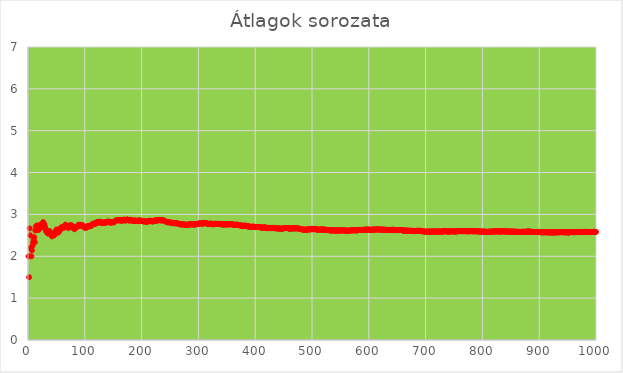
| Category | Series 0 |
|---|---|
| 1.0 | 2 |
| 2.0 | 1.5 |
| 3.0 | 2.667 |
| 4.0 | 2.5 |
| 5.0 | 2.2 |
| 6.0 | 2 |
| 7.0 | 2.143 |
| 8.0 | 2.25 |
| 9.0 | 2.333 |
| 10.0 | 2.4 |
| 11.0 | 2.455 |
| 12.0 | 2.333 |
| 13.0 | 2.615 |
| 14.0 | 2.714 |
| 15.0 | 2.733 |
| 16.0 | 2.625 |
| 17.0 | 2.706 |
| 18.0 | 2.667 |
| 19.0 | 2.632 |
| 20.0 | 2.75 |
| 21.0 | 2.714 |
| 22.0 | 2.682 |
| 23.0 | 2.696 |
| 24.0 | 2.708 |
| 25.0 | 2.76 |
| 26.0 | 2.808 |
| 27.0 | 2.815 |
| 28.0 | 2.75 |
| 29.0 | 2.759 |
| 30.0 | 2.7 |
| 31.0 | 2.645 |
| 32.0 | 2.594 |
| 33.0 | 2.606 |
| 34.0 | 2.559 |
| 35.0 | 2.543 |
| 36.0 | 2.556 |
| 37.0 | 2.595 |
| 38.0 | 2.605 |
| 39.0 | 2.564 |
| 40.0 | 2.525 |
| 41.0 | 2.512 |
| 42.0 | 2.476 |
| 43.0 | 2.512 |
| 44.0 | 2.545 |
| 45.0 | 2.511 |
| 46.0 | 2.5 |
| 47.0 | 2.511 |
| 48.0 | 2.542 |
| 49.0 | 2.592 |
| 50.0 | 2.64 |
| 51.0 | 2.608 |
| 52.0 | 2.596 |
| 53.0 | 2.566 |
| 54.0 | 2.574 |
| 55.0 | 2.618 |
| 56.0 | 2.661 |
| 57.0 | 2.632 |
| 58.0 | 2.672 |
| 59.0 | 2.695 |
| 60.0 | 2.683 |
| 61.0 | 2.705 |
| 62.0 | 2.677 |
| 63.0 | 2.683 |
| 64.0 | 2.703 |
| 65.0 | 2.708 |
| 66.0 | 2.758 |
| 67.0 | 2.731 |
| 68.0 | 2.721 |
| 69.0 | 2.696 |
| 70.0 | 2.7 |
| 71.0 | 2.676 |
| 72.0 | 2.722 |
| 73.0 | 2.726 |
| 74.0 | 2.743 |
| 75.0 | 2.72 |
| 76.0 | 2.697 |
| 77.0 | 2.74 |
| 78.0 | 2.718 |
| 79.0 | 2.696 |
| 80.0 | 2.675 |
| 81.0 | 2.654 |
| 82.0 | 2.646 |
| 83.0 | 2.675 |
| 84.0 | 2.679 |
| 85.0 | 2.694 |
| 86.0 | 2.698 |
| 87.0 | 2.713 |
| 88.0 | 2.739 |
| 89.0 | 2.753 |
| 90.0 | 2.733 |
| 91.0 | 2.725 |
| 92.0 | 2.75 |
| 93.0 | 2.731 |
| 94.0 | 2.745 |
| 95.0 | 2.747 |
| 96.0 | 2.74 |
| 97.0 | 2.722 |
| 98.0 | 2.714 |
| 99.0 | 2.697 |
| 100.0 | 2.68 |
| 101.0 | 2.683 |
| 102.0 | 2.706 |
| 103.0 | 2.689 |
| 104.0 | 2.692 |
| 105.0 | 2.714 |
| 106.0 | 2.726 |
| 107.0 | 2.72 |
| 108.0 | 2.722 |
| 109.0 | 2.716 |
| 110.0 | 2.727 |
| 111.0 | 2.721 |
| 112.0 | 2.741 |
| 113.0 | 2.77 |
| 114.0 | 2.763 |
| 115.0 | 2.774 |
| 116.0 | 2.784 |
| 117.0 | 2.778 |
| 118.0 | 2.771 |
| 119.0 | 2.782 |
| 120.0 | 2.8 |
| 121.0 | 2.81 |
| 122.0 | 2.82 |
| 123.0 | 2.821 |
| 124.0 | 2.806 |
| 125.0 | 2.808 |
| 126.0 | 2.825 |
| 127.0 | 2.811 |
| 128.0 | 2.812 |
| 129.0 | 2.798 |
| 130.0 | 2.808 |
| 131.0 | 2.802 |
| 132.0 | 2.803 |
| 133.0 | 2.805 |
| 134.0 | 2.806 |
| 135.0 | 2.8 |
| 136.0 | 2.809 |
| 137.0 | 2.818 |
| 138.0 | 2.804 |
| 139.0 | 2.82 |
| 140.0 | 2.814 |
| 141.0 | 2.83 |
| 142.0 | 2.831 |
| 143.0 | 2.818 |
| 144.0 | 2.806 |
| 145.0 | 2.814 |
| 146.0 | 2.801 |
| 147.0 | 2.816 |
| 148.0 | 2.818 |
| 149.0 | 2.812 |
| 150.0 | 2.82 |
| 151.0 | 2.808 |
| 152.0 | 2.829 |
| 153.0 | 2.837 |
| 154.0 | 2.851 |
| 155.0 | 2.852 |
| 156.0 | 2.859 |
| 157.0 | 2.854 |
| 158.0 | 2.867 |
| 159.0 | 2.862 |
| 160.0 | 2.869 |
| 161.0 | 2.857 |
| 162.0 | 2.858 |
| 163.0 | 2.865 |
| 164.0 | 2.854 |
| 165.0 | 2.855 |
| 166.0 | 2.849 |
| 167.0 | 2.862 |
| 168.0 | 2.869 |
| 169.0 | 2.876 |
| 170.0 | 2.865 |
| 171.0 | 2.854 |
| 172.0 | 2.855 |
| 173.0 | 2.867 |
| 174.0 | 2.879 |
| 175.0 | 2.874 |
| 176.0 | 2.864 |
| 177.0 | 2.859 |
| 178.0 | 2.854 |
| 179.0 | 2.872 |
| 180.0 | 2.861 |
| 181.0 | 2.856 |
| 182.0 | 2.857 |
| 183.0 | 2.863 |
| 184.0 | 2.853 |
| 185.0 | 2.843 |
| 186.0 | 2.844 |
| 187.0 | 2.84 |
| 188.0 | 2.851 |
| 189.0 | 2.857 |
| 190.0 | 2.847 |
| 191.0 | 2.843 |
| 192.0 | 2.844 |
| 193.0 | 2.85 |
| 194.0 | 2.845 |
| 195.0 | 2.856 |
| 196.0 | 2.852 |
| 197.0 | 2.853 |
| 198.0 | 2.854 |
| 199.0 | 2.844 |
| 200.0 | 2.85 |
| 201.0 | 2.846 |
| 202.0 | 2.842 |
| 203.0 | 2.833 |
| 204.0 | 2.838 |
| 205.0 | 2.834 |
| 206.0 | 2.835 |
| 207.0 | 2.831 |
| 208.0 | 2.822 |
| 209.0 | 2.833 |
| 210.0 | 2.833 |
| 211.0 | 2.834 |
| 212.0 | 2.83 |
| 213.0 | 2.84 |
| 214.0 | 2.846 |
| 215.0 | 2.851 |
| 216.0 | 2.847 |
| 217.0 | 2.843 |
| 218.0 | 2.835 |
| 219.0 | 2.831 |
| 220.0 | 2.836 |
| 221.0 | 2.837 |
| 222.0 | 2.847 |
| 223.0 | 2.848 |
| 224.0 | 2.853 |
| 225.0 | 2.862 |
| 226.0 | 2.854 |
| 227.0 | 2.85 |
| 228.0 | 2.855 |
| 229.0 | 2.869 |
| 230.0 | 2.861 |
| 231.0 | 2.87 |
| 232.0 | 2.862 |
| 233.0 | 2.863 |
| 234.0 | 2.863 |
| 235.0 | 2.855 |
| 236.0 | 2.86 |
| 237.0 | 2.865 |
| 238.0 | 2.857 |
| 239.0 | 2.854 |
| 240.0 | 2.846 |
| 241.0 | 2.838 |
| 242.0 | 2.835 |
| 243.0 | 2.827 |
| 244.0 | 2.82 |
| 245.0 | 2.816 |
| 246.0 | 2.813 |
| 247.0 | 2.81 |
| 248.0 | 2.819 |
| 249.0 | 2.815 |
| 250.0 | 2.808 |
| 251.0 | 2.805 |
| 252.0 | 2.798 |
| 253.0 | 2.794 |
| 254.0 | 2.799 |
| 255.0 | 2.8 |
| 256.0 | 2.797 |
| 257.0 | 2.79 |
| 258.0 | 2.787 |
| 259.0 | 2.795 |
| 260.0 | 2.792 |
| 261.0 | 2.789 |
| 262.0 | 2.794 |
| 263.0 | 2.787 |
| 264.0 | 2.78 |
| 265.0 | 2.774 |
| 266.0 | 2.774 |
| 267.0 | 2.772 |
| 268.0 | 2.765 |
| 269.0 | 2.762 |
| 270.0 | 2.756 |
| 271.0 | 2.764 |
| 272.0 | 2.765 |
| 273.0 | 2.762 |
| 274.0 | 2.759 |
| 275.0 | 2.76 |
| 276.0 | 2.757 |
| 277.0 | 2.751 |
| 278.0 | 2.752 |
| 279.0 | 2.746 |
| 280.0 | 2.754 |
| 281.0 | 2.751 |
| 282.0 | 2.762 |
| 283.0 | 2.76 |
| 284.0 | 2.757 |
| 285.0 | 2.761 |
| 286.0 | 2.769 |
| 287.0 | 2.763 |
| 288.0 | 2.771 |
| 289.0 | 2.765 |
| 290.0 | 2.766 |
| 291.0 | 2.763 |
| 292.0 | 2.76 |
| 293.0 | 2.754 |
| 294.0 | 2.759 |
| 295.0 | 2.766 |
| 296.0 | 2.77 |
| 297.0 | 2.768 |
| 298.0 | 2.768 |
| 299.0 | 2.769 |
| 300.0 | 2.777 |
| 301.0 | 2.784 |
| 302.0 | 2.788 |
| 303.0 | 2.785 |
| 304.0 | 2.789 |
| 305.0 | 2.787 |
| 306.0 | 2.781 |
| 307.0 | 2.775 |
| 308.0 | 2.786 |
| 309.0 | 2.793 |
| 310.0 | 2.794 |
| 311.0 | 2.791 |
| 312.0 | 2.788 |
| 313.0 | 2.792 |
| 314.0 | 2.79 |
| 315.0 | 2.784 |
| 316.0 | 2.778 |
| 317.0 | 2.773 |
| 318.0 | 2.767 |
| 319.0 | 2.774 |
| 320.0 | 2.781 |
| 321.0 | 2.779 |
| 322.0 | 2.776 |
| 323.0 | 2.777 |
| 324.0 | 2.772 |
| 325.0 | 2.766 |
| 326.0 | 2.761 |
| 327.0 | 2.768 |
| 328.0 | 2.771 |
| 329.0 | 2.778 |
| 330.0 | 2.776 |
| 331.0 | 2.77 |
| 332.0 | 2.771 |
| 333.0 | 2.778 |
| 334.0 | 2.775 |
| 335.0 | 2.773 |
| 336.0 | 2.768 |
| 337.0 | 2.772 |
| 338.0 | 2.769 |
| 339.0 | 2.767 |
| 340.0 | 2.765 |
| 341.0 | 2.765 |
| 342.0 | 2.769 |
| 343.0 | 2.764 |
| 344.0 | 2.759 |
| 345.0 | 2.754 |
| 346.0 | 2.757 |
| 347.0 | 2.767 |
| 348.0 | 2.764 |
| 349.0 | 2.762 |
| 350.0 | 2.766 |
| 351.0 | 2.764 |
| 352.0 | 2.764 |
| 353.0 | 2.762 |
| 354.0 | 2.763 |
| 355.0 | 2.763 |
| 356.0 | 2.772 |
| 357.0 | 2.768 |
| 358.0 | 2.765 |
| 359.0 | 2.763 |
| 360.0 | 2.758 |
| 361.0 | 2.759 |
| 362.0 | 2.754 |
| 363.0 | 2.752 |
| 364.0 | 2.755 |
| 365.0 | 2.751 |
| 366.0 | 2.751 |
| 367.0 | 2.757 |
| 368.0 | 2.753 |
| 369.0 | 2.751 |
| 370.0 | 2.749 |
| 371.0 | 2.747 |
| 372.0 | 2.742 |
| 373.0 | 2.737 |
| 374.0 | 2.738 |
| 375.0 | 2.733 |
| 376.0 | 2.731 |
| 377.0 | 2.729 |
| 378.0 | 2.728 |
| 379.0 | 2.728 |
| 380.0 | 2.732 |
| 381.0 | 2.732 |
| 382.0 | 2.728 |
| 383.0 | 2.731 |
| 384.0 | 2.727 |
| 385.0 | 2.722 |
| 386.0 | 2.718 |
| 387.0 | 2.713 |
| 388.0 | 2.714 |
| 389.0 | 2.71 |
| 390.0 | 2.71 |
| 391.0 | 2.708 |
| 392.0 | 2.704 |
| 393.0 | 2.7 |
| 394.0 | 2.701 |
| 395.0 | 2.706 |
| 396.0 | 2.705 |
| 397.0 | 2.708 |
| 398.0 | 2.704 |
| 399.0 | 2.704 |
| 400.0 | 2.7 |
| 401.0 | 2.696 |
| 402.0 | 2.701 |
| 403.0 | 2.702 |
| 404.0 | 2.698 |
| 405.0 | 2.699 |
| 406.0 | 2.7 |
| 407.0 | 2.7 |
| 408.0 | 2.696 |
| 409.0 | 2.692 |
| 410.0 | 2.688 |
| 411.0 | 2.686 |
| 412.0 | 2.682 |
| 413.0 | 2.688 |
| 414.0 | 2.688 |
| 415.0 | 2.689 |
| 416.0 | 2.685 |
| 417.0 | 2.691 |
| 418.0 | 2.687 |
| 419.0 | 2.683 |
| 420.0 | 2.679 |
| 421.0 | 2.675 |
| 422.0 | 2.675 |
| 423.0 | 2.674 |
| 424.0 | 2.682 |
| 425.0 | 2.678 |
| 426.0 | 2.674 |
| 427.0 | 2.672 |
| 428.0 | 2.673 |
| 429.0 | 2.674 |
| 430.0 | 2.674 |
| 431.0 | 2.68 |
| 432.0 | 2.678 |
| 433.0 | 2.674 |
| 434.0 | 2.675 |
| 435.0 | 2.671 |
| 436.0 | 2.667 |
| 437.0 | 2.67 |
| 438.0 | 2.667 |
| 439.0 | 2.67 |
| 440.0 | 2.666 |
| 441.0 | 2.664 |
| 442.0 | 2.665 |
| 443.0 | 2.661 |
| 444.0 | 2.662 |
| 445.0 | 2.663 |
| 446.0 | 2.659 |
| 447.0 | 2.658 |
| 448.0 | 2.658 |
| 449.0 | 2.664 |
| 450.0 | 2.671 |
| 451.0 | 2.676 |
| 452.0 | 2.675 |
| 453.0 | 2.671 |
| 454.0 | 2.674 |
| 455.0 | 2.675 |
| 456.0 | 2.678 |
| 457.0 | 2.674 |
| 458.0 | 2.67 |
| 459.0 | 2.667 |
| 460.0 | 2.663 |
| 461.0 | 2.659 |
| 462.0 | 2.66 |
| 463.0 | 2.663 |
| 464.0 | 2.668 |
| 465.0 | 2.667 |
| 466.0 | 2.663 |
| 467.0 | 2.666 |
| 468.0 | 2.667 |
| 469.0 | 2.67 |
| 470.0 | 2.668 |
| 471.0 | 2.669 |
| 472.0 | 2.667 |
| 473.0 | 2.672 |
| 474.0 | 2.669 |
| 475.0 | 2.667 |
| 476.0 | 2.664 |
| 477.0 | 2.66 |
| 478.0 | 2.657 |
| 479.0 | 2.653 |
| 480.0 | 2.65 |
| 481.0 | 2.647 |
| 482.0 | 2.645 |
| 483.0 | 2.642 |
| 484.0 | 2.64 |
| 485.0 | 2.637 |
| 486.0 | 2.634 |
| 487.0 | 2.634 |
| 488.0 | 2.633 |
| 489.0 | 2.634 |
| 490.0 | 2.637 |
| 491.0 | 2.64 |
| 492.0 | 2.638 |
| 493.0 | 2.641 |
| 494.0 | 2.644 |
| 495.0 | 2.642 |
| 496.0 | 2.645 |
| 497.0 | 2.642 |
| 498.0 | 2.645 |
| 499.0 | 2.651 |
| 500.0 | 2.65 |
| 501.0 | 2.649 |
| 502.0 | 2.645 |
| 503.0 | 2.65 |
| 504.0 | 2.649 |
| 505.0 | 2.65 |
| 506.0 | 2.646 |
| 507.0 | 2.643 |
| 508.0 | 2.642 |
| 509.0 | 2.64 |
| 510.0 | 2.639 |
| 511.0 | 2.636 |
| 512.0 | 2.633 |
| 513.0 | 2.634 |
| 514.0 | 2.64 |
| 515.0 | 2.637 |
| 516.0 | 2.638 |
| 517.0 | 2.64 |
| 518.0 | 2.639 |
| 519.0 | 2.64 |
| 520.0 | 2.64 |
| 521.0 | 2.639 |
| 522.0 | 2.636 |
| 523.0 | 2.633 |
| 524.0 | 2.632 |
| 525.0 | 2.63 |
| 526.0 | 2.629 |
| 527.0 | 2.63 |
| 528.0 | 2.629 |
| 529.0 | 2.626 |
| 530.0 | 2.623 |
| 531.0 | 2.621 |
| 532.0 | 2.62 |
| 533.0 | 2.617 |
| 534.0 | 2.62 |
| 535.0 | 2.619 |
| 536.0 | 2.618 |
| 537.0 | 2.618 |
| 538.0 | 2.621 |
| 539.0 | 2.618 |
| 540.0 | 2.617 |
| 541.0 | 2.614 |
| 542.0 | 2.611 |
| 543.0 | 2.615 |
| 544.0 | 2.619 |
| 545.0 | 2.617 |
| 546.0 | 2.614 |
| 547.0 | 2.618 |
| 548.0 | 2.617 |
| 549.0 | 2.619 |
| 550.0 | 2.62 |
| 551.0 | 2.617 |
| 552.0 | 2.618 |
| 553.0 | 2.618 |
| 554.0 | 2.623 |
| 555.0 | 2.62 |
| 556.0 | 2.617 |
| 557.0 | 2.618 |
| 558.0 | 2.615 |
| 559.0 | 2.612 |
| 560.0 | 2.612 |
| 561.0 | 2.61 |
| 562.0 | 2.61 |
| 563.0 | 2.615 |
| 564.0 | 2.612 |
| 565.0 | 2.609 |
| 566.0 | 2.611 |
| 567.0 | 2.614 |
| 568.0 | 2.62 |
| 569.0 | 2.622 |
| 570.0 | 2.619 |
| 571.0 | 2.62 |
| 572.0 | 2.619 |
| 573.0 | 2.621 |
| 574.0 | 2.622 |
| 575.0 | 2.621 |
| 576.0 | 2.622 |
| 577.0 | 2.62 |
| 578.0 | 2.618 |
| 579.0 | 2.617 |
| 580.0 | 2.621 |
| 581.0 | 2.627 |
| 582.0 | 2.629 |
| 583.0 | 2.631 |
| 584.0 | 2.63 |
| 585.0 | 2.631 |
| 586.0 | 2.63 |
| 587.0 | 2.629 |
| 588.0 | 2.628 |
| 589.0 | 2.628 |
| 590.0 | 2.627 |
| 591.0 | 2.633 |
| 592.0 | 2.632 |
| 593.0 | 2.636 |
| 594.0 | 2.635 |
| 595.0 | 2.637 |
| 596.0 | 2.634 |
| 597.0 | 2.637 |
| 598.0 | 2.639 |
| 599.0 | 2.636 |
| 600.0 | 2.637 |
| 601.0 | 2.634 |
| 602.0 | 2.633 |
| 603.0 | 2.632 |
| 604.0 | 2.632 |
| 605.0 | 2.633 |
| 606.0 | 2.634 |
| 607.0 | 2.636 |
| 608.0 | 2.637 |
| 609.0 | 2.639 |
| 610.0 | 2.639 |
| 611.0 | 2.637 |
| 612.0 | 2.637 |
| 613.0 | 2.636 |
| 614.0 | 2.642 |
| 615.0 | 2.641 |
| 616.0 | 2.643 |
| 617.0 | 2.643 |
| 618.0 | 2.642 |
| 619.0 | 2.64 |
| 620.0 | 2.639 |
| 621.0 | 2.638 |
| 622.0 | 2.637 |
| 623.0 | 2.636 |
| 624.0 | 2.633 |
| 625.0 | 2.637 |
| 626.0 | 2.637 |
| 627.0 | 2.636 |
| 628.0 | 2.634 |
| 629.0 | 2.633 |
| 630.0 | 2.632 |
| 631.0 | 2.631 |
| 632.0 | 2.628 |
| 633.0 | 2.63 |
| 634.0 | 2.631 |
| 635.0 | 2.628 |
| 636.0 | 2.632 |
| 637.0 | 2.63 |
| 638.0 | 2.627 |
| 639.0 | 2.626 |
| 640.0 | 2.63 |
| 641.0 | 2.635 |
| 642.0 | 2.634 |
| 643.0 | 2.631 |
| 644.0 | 2.632 |
| 645.0 | 2.633 |
| 646.0 | 2.63 |
| 647.0 | 2.628 |
| 648.0 | 2.625 |
| 649.0 | 2.626 |
| 650.0 | 2.628 |
| 651.0 | 2.625 |
| 652.0 | 2.63 |
| 653.0 | 2.628 |
| 654.0 | 2.627 |
| 655.0 | 2.626 |
| 656.0 | 2.628 |
| 657.0 | 2.626 |
| 658.0 | 2.623 |
| 659.0 | 2.621 |
| 660.0 | 2.618 |
| 661.0 | 2.616 |
| 662.0 | 2.613 |
| 663.0 | 2.612 |
| 664.0 | 2.613 |
| 665.0 | 2.611 |
| 666.0 | 2.613 |
| 667.0 | 2.615 |
| 668.0 | 2.612 |
| 669.0 | 2.61 |
| 670.0 | 2.61 |
| 671.0 | 2.608 |
| 672.0 | 2.61 |
| 673.0 | 2.611 |
| 674.0 | 2.608 |
| 675.0 | 2.606 |
| 676.0 | 2.607 |
| 677.0 | 2.609 |
| 678.0 | 2.606 |
| 679.0 | 2.604 |
| 680.0 | 2.601 |
| 681.0 | 2.601 |
| 682.0 | 2.6 |
| 683.0 | 2.605 |
| 684.0 | 2.605 |
| 685.0 | 2.609 |
| 686.0 | 2.608 |
| 687.0 | 2.61 |
| 688.0 | 2.608 |
| 689.0 | 2.608 |
| 690.0 | 2.609 |
| 691.0 | 2.606 |
| 692.0 | 2.604 |
| 693.0 | 2.602 |
| 694.0 | 2.599 |
| 695.0 | 2.597 |
| 696.0 | 2.595 |
| 697.0 | 2.593 |
| 698.0 | 2.59 |
| 699.0 | 2.588 |
| 700.0 | 2.586 |
| 701.0 | 2.585 |
| 702.0 | 2.587 |
| 703.0 | 2.589 |
| 704.0 | 2.589 |
| 705.0 | 2.587 |
| 706.0 | 2.589 |
| 707.0 | 2.587 |
| 708.0 | 2.588 |
| 709.0 | 2.59 |
| 710.0 | 2.59 |
| 711.0 | 2.594 |
| 712.0 | 2.591 |
| 713.0 | 2.589 |
| 714.0 | 2.59 |
| 715.0 | 2.59 |
| 716.0 | 2.594 |
| 717.0 | 2.593 |
| 718.0 | 2.592 |
| 719.0 | 2.59 |
| 720.0 | 2.59 |
| 721.0 | 2.592 |
| 722.0 | 2.59 |
| 723.0 | 2.592 |
| 724.0 | 2.591 |
| 725.0 | 2.59 |
| 726.0 | 2.59 |
| 727.0 | 2.589 |
| 728.0 | 2.591 |
| 729.0 | 2.591 |
| 730.0 | 2.595 |
| 731.0 | 2.592 |
| 732.0 | 2.597 |
| 733.0 | 2.598 |
| 734.0 | 2.598 |
| 735.0 | 2.6 |
| 736.0 | 2.598 |
| 737.0 | 2.597 |
| 738.0 | 2.595 |
| 739.0 | 2.593 |
| 740.0 | 2.591 |
| 741.0 | 2.591 |
| 742.0 | 2.593 |
| 743.0 | 2.591 |
| 744.0 | 2.593 |
| 745.0 | 2.593 |
| 746.0 | 2.597 |
| 747.0 | 2.598 |
| 748.0 | 2.598 |
| 749.0 | 2.595 |
| 750.0 | 2.593 |
| 751.0 | 2.595 |
| 752.0 | 2.593 |
| 753.0 | 2.591 |
| 754.0 | 2.593 |
| 755.0 | 2.593 |
| 756.0 | 2.597 |
| 757.0 | 2.597 |
| 758.0 | 2.602 |
| 759.0 | 2.603 |
| 760.0 | 2.601 |
| 761.0 | 2.602 |
| 762.0 | 2.6 |
| 763.0 | 2.6 |
| 764.0 | 2.601 |
| 765.0 | 2.6 |
| 766.0 | 2.602 |
| 767.0 | 2.601 |
| 768.0 | 2.599 |
| 769.0 | 2.602 |
| 770.0 | 2.603 |
| 771.0 | 2.601 |
| 772.0 | 2.598 |
| 773.0 | 2.596 |
| 774.0 | 2.596 |
| 775.0 | 2.599 |
| 776.0 | 2.599 |
| 777.0 | 2.598 |
| 778.0 | 2.6 |
| 779.0 | 2.602 |
| 780.0 | 2.6 |
| 781.0 | 2.599 |
| 782.0 | 2.598 |
| 783.0 | 2.6 |
| 784.0 | 2.598 |
| 785.0 | 2.596 |
| 786.0 | 2.599 |
| 787.0 | 2.597 |
| 788.0 | 2.598 |
| 789.0 | 2.599 |
| 790.0 | 2.599 |
| 791.0 | 2.597 |
| 792.0 | 2.596 |
| 793.0 | 2.594 |
| 794.0 | 2.592 |
| 795.0 | 2.59 |
| 796.0 | 2.589 |
| 797.0 | 2.588 |
| 798.0 | 2.588 |
| 799.0 | 2.591 |
| 800.0 | 2.59 |
| 801.0 | 2.589 |
| 802.0 | 2.589 |
| 803.0 | 2.592 |
| 804.0 | 2.59 |
| 805.0 | 2.588 |
| 806.0 | 2.586 |
| 807.0 | 2.584 |
| 808.0 | 2.582 |
| 809.0 | 2.585 |
| 810.0 | 2.583 |
| 811.0 | 2.584 |
| 812.0 | 2.589 |
| 813.0 | 2.588 |
| 814.0 | 2.588 |
| 815.0 | 2.589 |
| 816.0 | 2.588 |
| 817.0 | 2.591 |
| 818.0 | 2.59 |
| 819.0 | 2.591 |
| 820.0 | 2.593 |
| 821.0 | 2.596 |
| 822.0 | 2.594 |
| 823.0 | 2.597 |
| 824.0 | 2.595 |
| 825.0 | 2.595 |
| 826.0 | 2.597 |
| 827.0 | 2.595 |
| 828.0 | 2.594 |
| 829.0 | 2.592 |
| 830.0 | 2.593 |
| 831.0 | 2.593 |
| 832.0 | 2.595 |
| 833.0 | 2.594 |
| 834.0 | 2.595 |
| 835.0 | 2.595 |
| 836.0 | 2.597 |
| 837.0 | 2.597 |
| 838.0 | 2.595 |
| 839.0 | 2.594 |
| 840.0 | 2.592 |
| 841.0 | 2.593 |
| 842.0 | 2.593 |
| 843.0 | 2.594 |
| 844.0 | 2.592 |
| 845.0 | 2.591 |
| 846.0 | 2.589 |
| 847.0 | 2.587 |
| 848.0 | 2.59 |
| 849.0 | 2.591 |
| 850.0 | 2.591 |
| 851.0 | 2.589 |
| 852.0 | 2.588 |
| 853.0 | 2.591 |
| 854.0 | 2.59 |
| 855.0 | 2.588 |
| 856.0 | 2.588 |
| 857.0 | 2.587 |
| 858.0 | 2.587 |
| 859.0 | 2.586 |
| 860.0 | 2.585 |
| 861.0 | 2.583 |
| 862.0 | 2.586 |
| 863.0 | 2.585 |
| 864.0 | 2.583 |
| 865.0 | 2.582 |
| 866.0 | 2.58 |
| 867.0 | 2.582 |
| 868.0 | 2.581 |
| 869.0 | 2.583 |
| 870.0 | 2.584 |
| 871.0 | 2.583 |
| 872.0 | 2.585 |
| 873.0 | 2.583 |
| 874.0 | 2.585 |
| 875.0 | 2.583 |
| 876.0 | 2.583 |
| 877.0 | 2.586 |
| 878.0 | 2.589 |
| 879.0 | 2.593 |
| 880.0 | 2.592 |
| 881.0 | 2.591 |
| 882.0 | 2.59 |
| 883.0 | 2.589 |
| 884.0 | 2.587 |
| 885.0 | 2.586 |
| 886.0 | 2.585 |
| 887.0 | 2.583 |
| 888.0 | 2.581 |
| 889.0 | 2.58 |
| 890.0 | 2.58 |
| 891.0 | 2.578 |
| 892.0 | 2.58 |
| 893.0 | 2.581 |
| 894.0 | 2.581 |
| 895.0 | 2.579 |
| 896.0 | 2.581 |
| 897.0 | 2.581 |
| 898.0 | 2.58 |
| 899.0 | 2.58 |
| 900.0 | 2.579 |
| 901.0 | 2.577 |
| 902.0 | 2.576 |
| 903.0 | 2.576 |
| 904.0 | 2.574 |
| 905.0 | 2.572 |
| 906.0 | 2.572 |
| 907.0 | 2.571 |
| 908.0 | 2.574 |
| 909.0 | 2.573 |
| 910.0 | 2.574 |
| 911.0 | 2.572 |
| 912.0 | 2.576 |
| 913.0 | 2.576 |
| 914.0 | 2.574 |
| 915.0 | 2.573 |
| 916.0 | 2.571 |
| 917.0 | 2.57 |
| 918.0 | 2.572 |
| 919.0 | 2.571 |
| 920.0 | 2.571 |
| 921.0 | 2.57 |
| 922.0 | 2.568 |
| 923.0 | 2.568 |
| 924.0 | 2.57 |
| 925.0 | 2.569 |
| 926.0 | 2.568 |
| 927.0 | 2.572 |
| 928.0 | 2.571 |
| 929.0 | 2.574 |
| 930.0 | 2.572 |
| 931.0 | 2.571 |
| 932.0 | 2.575 |
| 933.0 | 2.574 |
| 934.0 | 2.573 |
| 935.0 | 2.573 |
| 936.0 | 2.575 |
| 937.0 | 2.576 |
| 938.0 | 2.575 |
| 939.0 | 2.576 |
| 940.0 | 2.577 |
| 941.0 | 2.577 |
| 942.0 | 2.575 |
| 943.0 | 2.575 |
| 944.0 | 2.573 |
| 945.0 | 2.574 |
| 946.0 | 2.573 |
| 947.0 | 2.573 |
| 948.0 | 2.573 |
| 949.0 | 2.572 |
| 950.0 | 2.572 |
| 951.0 | 2.57 |
| 952.0 | 2.569 |
| 953.0 | 2.573 |
| 954.0 | 2.574 |
| 955.0 | 2.578 |
| 956.0 | 2.578 |
| 957.0 | 2.581 |
| 958.0 | 2.579 |
| 959.0 | 2.578 |
| 960.0 | 2.576 |
| 961.0 | 2.575 |
| 962.0 | 2.576 |
| 963.0 | 2.577 |
| 964.0 | 2.576 |
| 965.0 | 2.576 |
| 966.0 | 2.577 |
| 967.0 | 2.579 |
| 968.0 | 2.581 |
| 969.0 | 2.58 |
| 970.0 | 2.581 |
| 971.0 | 2.58 |
| 972.0 | 2.579 |
| 973.0 | 2.579 |
| 974.0 | 2.579 |
| 975.0 | 2.581 |
| 976.0 | 2.581 |
| 977.0 | 2.58 |
| 978.0 | 2.582 |
| 979.0 | 2.583 |
| 980.0 | 2.583 |
| 981.0 | 2.583 |
| 982.0 | 2.582 |
| 983.0 | 2.583 |
| 984.0 | 2.581 |
| 985.0 | 2.58 |
| 986.0 | 2.579 |
| 987.0 | 2.579 |
| 988.0 | 2.58 |
| 989.0 | 2.579 |
| 990.0 | 2.578 |
| 991.0 | 2.579 |
| 992.0 | 2.581 |
| 993.0 | 2.58 |
| 994.0 | 2.58 |
| 995.0 | 2.583 |
| 996.0 | 2.584 |
| 997.0 | 2.585 |
| 998.0 | 2.583 |
| 999.0 | 2.582 |
| 1000.0 | 2.581 |